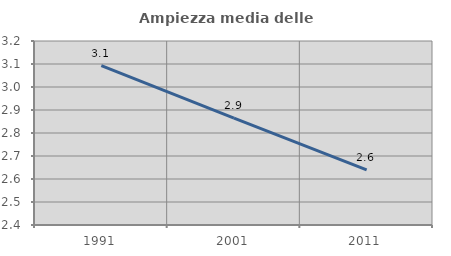
| Category | Ampiezza media delle famiglie |
|---|---|
| 1991.0 | 3.093 |
| 2001.0 | 2.865 |
| 2011.0 | 2.639 |